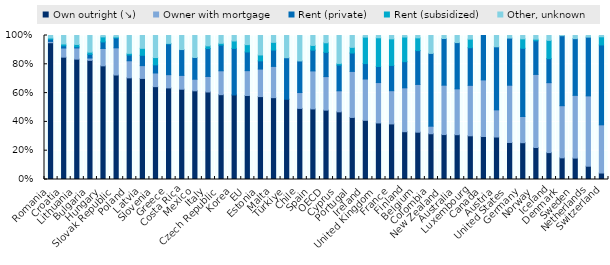
| Category | Own outright (↘) | Owner with mortgage | Rent (private) | Rent (subsidized) | Other, unknown |
|---|---|---|---|---|---|
| Romania | 0.95 | 0.009 | 0.015 | 0.009 | 0.017 |
| Croatia | 0.849 | 0.064 | 0.015 | 0.013 | 0.059 |
| Lithuania | 0.836 | 0.078 | 0.008 | 0.016 | 0.062 |
| Bulgaria | 0.827 | 0.016 | 0.026 | 0.015 | 0.115 |
| Hungary | 0.789 | 0.121 | 0.045 | 0.035 | 0.01 |
| Slovak Republic | 0.726 | 0.189 | 0.068 | 0.007 | 0.01 |
| Poland | 0.706 | 0.119 | 0.04 | 0.012 | 0.124 |
| Latvia | 0.702 | 0.089 | 0.072 | 0.048 | 0.089 |
| Slovenia | 0.645 | 0.095 | 0.056 | 0.051 | 0.153 |
| Greece | 0.636 | 0.092 | 0.214 | 0.004 | 0.055 |
| Costa Rica | 0.627 | 0.096 | 0.18 | 0 | 0.098 |
| Mexico | 0.616 | 0.08 | 0.151 | 0 | 0.153 |
| Italy | 0.608 | 0.108 | 0.194 | 0.019 | 0.072 |
| Czech Republic | 0.589 | 0.166 | 0.178 | 0.012 | 0.054 |
| Korea | 0.587 | 0 | 0.323 | 0.052 | 0.038 |
| EU | 0.583 | 0.173 | 0.13 | 0.051 | 0.063 |
| Estonia | 0.576 | 0.191 | 0.057 | 0.041 | 0.135 |
| Malta | 0.568 | 0.217 | 0.114 | 0.054 | 0.048 |
| Türkiye | 0.557 | 0 | 0.288 | 0 | 0.154 |
| Chile | 0.494 | 0.11 | 0.219 | 0 | 0.177 |
| Spain | 0.49 | 0.264 | 0.144 | 0.033 | 0.069 |
| OECD | 0.482 | 0.233 | 0.168 | 0.067 | 0.05 |
| Cyprus | 0.47 | 0.146 | 0.179 | 0.011 | 0.194 |
| Portugal | 0.431 | 0.32 | 0.128 | 0.039 | 0.082 |
| Ireland | 0.411 | 0.287 | 0.107 | 0.184 | 0.011 |
| United Kingdom | 0.393 | 0.28 | 0.111 | 0.2 | 0.016 |
| France | 0.386 | 0.231 | 0.175 | 0.185 | 0.023 |
| Finland | 0.332 | 0.305 | 0.182 | 0.171 | 0.011 |
| Belgium | 0.329 | 0.332 | 0.235 | 0.089 | 0.016 |
| Colombia | 0.318 | 0.052 | 0.506 | 0 | 0.124 |
| New Zealand | 0.312 | 0.343 | 0.324 | 0 | 0.021 |
| Australia | 0.311 | 0.318 | 0.321 | 0 | 0.049 |
| Luxembourg | 0.303 | 0.35 | 0.261 | 0.06 | 0.025 |
| Canada | 0.299 | 0.393 | 0.308 | 0 | 0 |
| Austria | 0.295 | 0.189 | 0.438 | 0 | 0.078 |
| United States | 0.257 | 0.397 | 0.327 | 0 | 0.018 |
| Germany | 0.256 | 0.182 | 0.473 | 0.066 | 0.023 |
| Norway | 0.222 | 0.508 | 0.234 | 0.011 | 0.025 |
| Iceland | 0.187 | 0.486 | 0.167 | 0.127 | 0.034 |
| Denmark | 0.15 | 0.362 | 0.486 | 0 | 0.001 |
| Sweden | 0.149 | 0.436 | 0.394 | 0 | 0.022 |
| Netherlands | 0.092 | 0.488 | 0.408 | 0 | 0.011 |
| Switzerland | 0.045 | 0.335 | 0.555 | 0.057 | 0.009 |